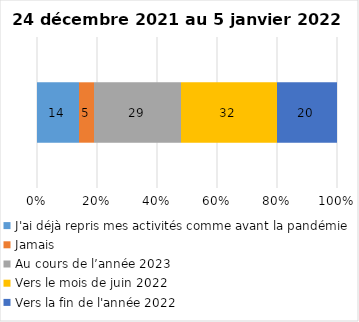
| Category | J'ai déjà repris mes activités comme avant la pandémie | Jamais | Au cours de l’année 2023 | Vers le mois de juin 2022 | Vers la fin de l'année 2022 |
|---|---|---|---|---|---|
| 0 | 14 | 5 | 29 | 32 | 20 |